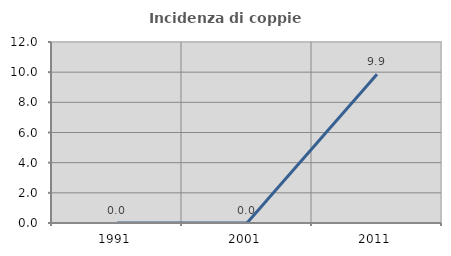
| Category | Incidenza di coppie miste |
|---|---|
| 1991.0 | 0 |
| 2001.0 | 0 |
| 2011.0 | 9.859 |